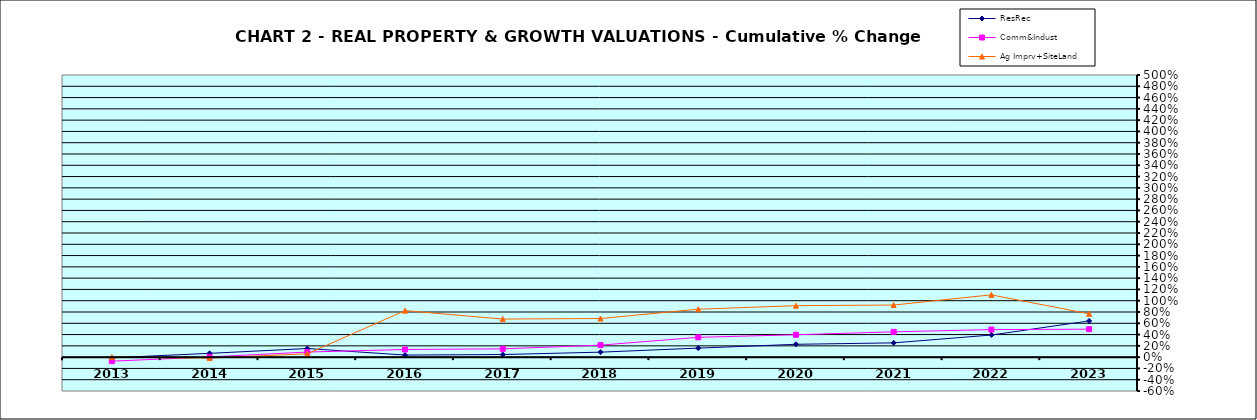
| Category | ResRec | Comm&Indust | Ag Imprv+SiteLand |
|---|---|---|---|
| 2013.0 | -0.012 | -0.072 | 0 |
| 2014.0 | 0.067 | 0.004 | -0.017 |
| 2015.0 | 0.153 | 0.09 | 0.059 |
| 2016.0 | 0.037 | 0.136 | 0.824 |
| 2017.0 | 0.046 | 0.147 | 0.675 |
| 2018.0 | 0.089 | 0.213 | 0.684 |
| 2019.0 | 0.16 | 0.351 | 0.85 |
| 2020.0 | 0.228 | 0.397 | 0.912 |
| 2021.0 | 0.253 | 0.448 | 0.924 |
| 2022.0 | 0.392 | 0.488 | 1.104 |
| 2023.0 | 0.642 | 0.496 | 0.768 |